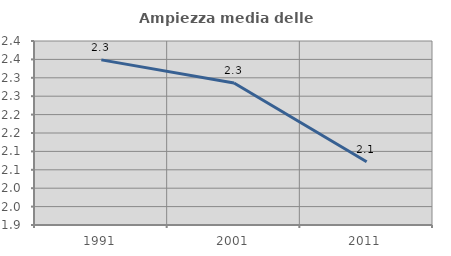
| Category | Ampiezza media delle famiglie |
|---|---|
| 1991.0 | 2.349 |
| 2001.0 | 2.286 |
| 2011.0 | 2.072 |